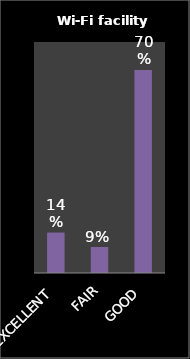
| Category | Series 0 |
|---|---|
| EXCELLENT | 0.14 |
| FAIR | 0.09 |
| GOOD | 0.703 |